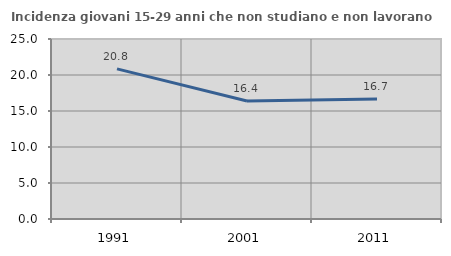
| Category | Incidenza giovani 15-29 anni che non studiano e non lavorano  |
|---|---|
| 1991.0 | 20.846 |
| 2001.0 | 16.393 |
| 2011.0 | 16.667 |